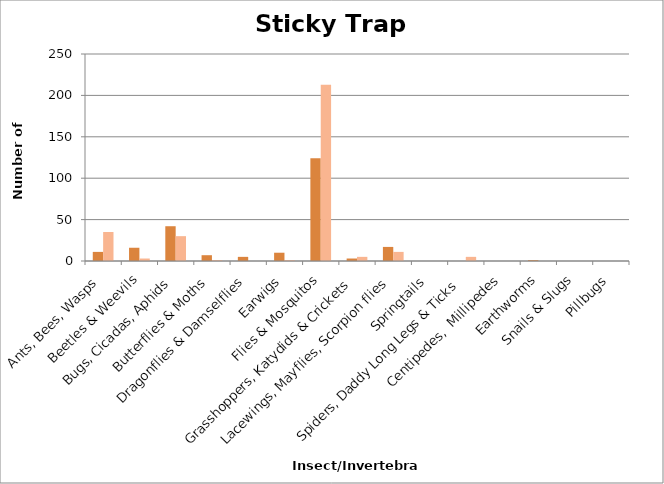
| Category | Sticky Trap Sum (Row 2) | Sticky Trap Sum      (Row 4) |
|---|---|---|
| Ants, Bees, Wasps | 11 | 35 |
| Beetles & Weevils | 16 | 3 |
| Bugs, Cicadas, Aphids | 42 | 30 |
| Butterflies & Moths | 7 | 1 |
| Dragonflies & Damselflies | 5 | 0 |
| Earwigs | 10 | 1 |
| Flies & Mosquitos | 124 | 213 |
| Grasshoppers, Katydids & Crickets | 3 | 5 |
| Lacewings, Mayflies, Scorpion flies | 17 | 11 |
| Springtails | 0 | 0 |
| Spiders, Daddy Long Legs & Ticks | 0 | 5 |
| Centipedes,  Millipedes | 0 | 0 |
| Earthworms | 1 | 0 |
| Snails & Slugs | 0 | 0 |
| Pillbugs | 0 | 0 |